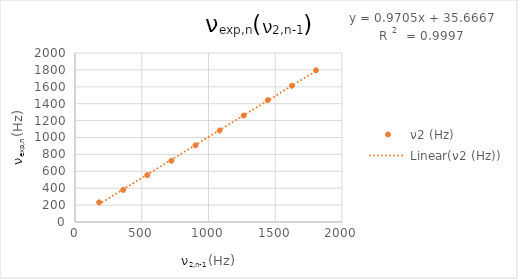
| Category | ν2 (Hz) |
|---|---|
| 180.5263157894737 | 232.5 |
| 361.0526315789474 | 380 |
| 541.578947368421 | 555 |
| 722.1052631578948 | 725 |
| 902.6315789473684 | 907.5 |
| 1083.157894736842 | 1082.5 |
| 1263.6842105263158 | 1260 |
| 1444.2105263157896 | 1442.5 |
| 1624.7368421052631 | 1612.5 |
| 1805.2631578947369 | 1795 |